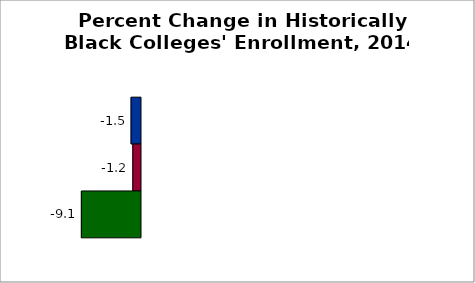
| Category | 50 states and D.C. | SREB states | State |
|---|---|---|---|
| 2014 to 2019 | -1.45 | -1.182 | -9.097 |